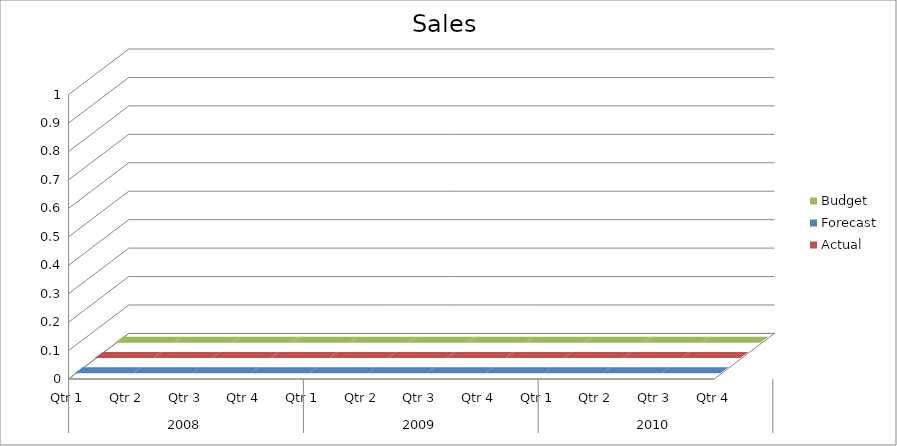
| Category | Budget | Forecast | Actual |
|---|---|---|---|
| 0 | 2510 | 800 | 2310 |
| 1 | 3240 | 1200 | 3350 |
| 2 | 740 | 1460 | 3180 |
| 3 | 3160 | 1770 | 2970 |
| 4 | 2280 | 2390 | 3190 |
| 5 | 1830 | 1850 | 2260 |
| 6 | 1190 | 2850 | 510 |
| 7 | 1390 | 850 | 2030 |
| 8 | 2230 | 2930 | 2520 |
| 9 | 2710 | 1980 | 2030 |
| 10 | 2350 | 510 | 2510 |
| 11 | 2770 | 3500 | 2790 |